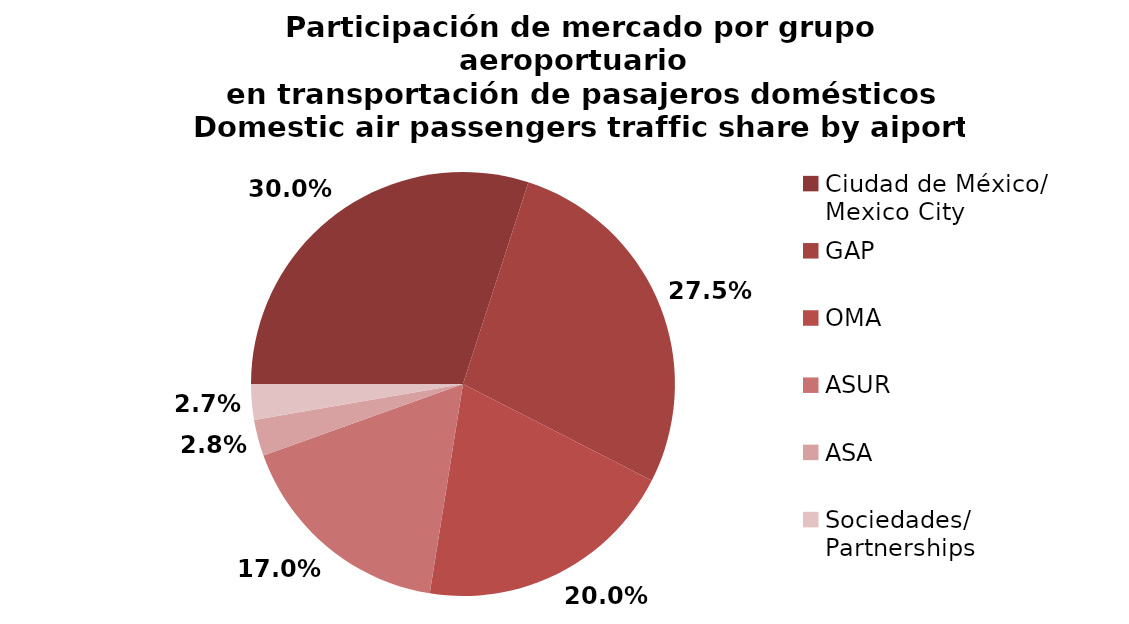
| Category | Series 0 |
|---|---|
| Ciudad de México/
Mexico City | 2652.795 |
| GAP | 2434.504 |
| OMA | 1767.909 |
| ASUR | 1504.479 |
| ASA | 245.054 |
| Sociedades/
Partnerships | 239.698 |